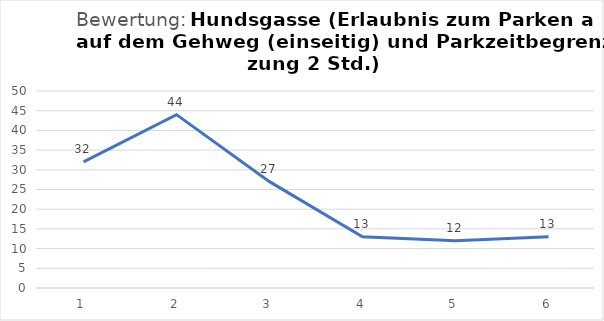
| Category | Series 0 |
|---|---|
| 1.0 | 32 |
| 2.0 | 44 |
| 3.0 | 27 |
| 4.0 | 13 |
| 5.0 | 12 |
| 6.0 | 13 |